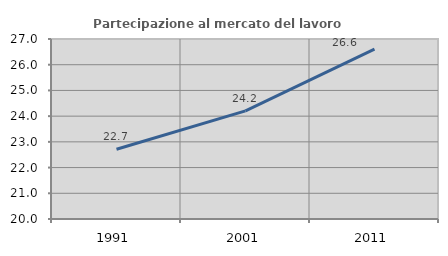
| Category | Partecipazione al mercato del lavoro  femminile |
|---|---|
| 1991.0 | 22.713 |
| 2001.0 | 24.203 |
| 2011.0 | 26.604 |